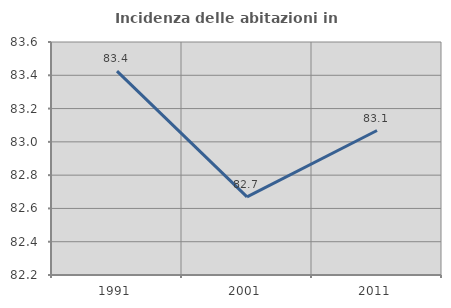
| Category | Incidenza delle abitazioni in proprietà  |
|---|---|
| 1991.0 | 83.425 |
| 2001.0 | 82.669 |
| 2011.0 | 83.068 |